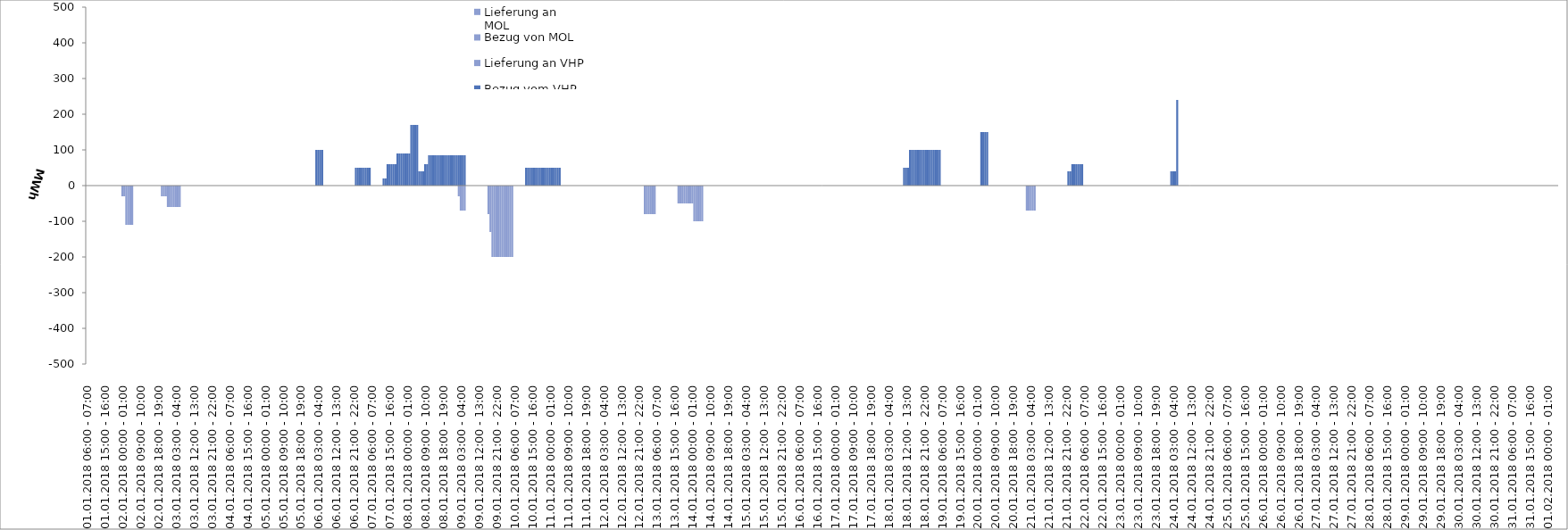
| Category | Bezug vom VHP | Lieferung an VHP | Bezug von MOL | Lieferung an MOL |
|---|---|---|---|---|
| 01.01.2018 06:00 - 07:00 | 0 | 0 | 0 | 0 |
| 01.01.2018 07:00 - 08:00 | 0 | 0 | 0 | 0 |
| 01.01.2018 08:00 - 09:00 | 0 | 0 | 0 | 0 |
| 01.01.2018 09:00 - 10:00 | 0 | 0 | 0 | 0 |
| 01.01.2018 10:00 - 11:00 | 0 | 0 | 0 | 0 |
| 01.01.2018 11:00 - 12:00 | 0 | 0 | 0 | 0 |
| 01.01.2018 12:00 - 13:00 | 0 | 0 | 0 | 0 |
| 01.01.2018 13:00 - 14:00 | 0 | 0 | 0 | 0 |
| 01.01.2018 14:00 - 15:00 | 0 | 0 | 0 | 0 |
| 01.01.2018 15:00 - 16:00 | 0 | 0 | 0 | 0 |
| 01.01.2018 16:00 - 17:00 | 0 | 0 | 0 | 0 |
| 01.01.2018 17:00 - 18:00 | 0 | 0 | 0 | 0 |
| 01.01.2018 18:00 - 19:00 | 0 | 0 | 0 | 0 |
| 01.01.2018 19:00 - 20:00 | 0 | 0 | 0 | 0 |
| 01.01.2018 20:00 - 21:00 | 0 | 0 | 0 | 0 |
| 01.01.2018 21:00 - 22:00 | 0 | 0 | 0 | 0 |
| 01.01.2018 22:00 - 23:00 | 0 | 0 | 0 | 0 |
| 01.01.2018 23:00 - 24:00 | 0 | 0 | 0 | 0 |
| 02.01.2018 00:00 - 01:00 | 0 | -30 | 0 | 0 |
| 02.01.2018 01:00 - 02:00 | 0 | -30 | 0 | 0 |
| 02.01.2018 02:00 - 03:00 | 0 | -110 | 0 | 0 |
| 02.01.2018 03:00 - 04:00 | 0 | -110 | 0 | 0 |
| 02.01.2018 04:00 - 05:00 | 0 | -110 | 0 | 0 |
| 02.01.2018 05:00 - 06:00 | 0 | -110 | 0 | 0 |
| 02.01.2018 06:00 - 07:00 | 0 | 0 | 0 | 0 |
| 02.01.2018 07:00 - 08:00 | 0 | 0 | 0 | 0 |
| 02.01.2018 08:00 - 09:00 | 0 | 0 | 0 | 0 |
| 02.01.2018 09:00 - 10:00 | 0 | 0 | 0 | 0 |
| 02.01.2018 10:00 - 11:00 | 0 | 0 | 0 | 0 |
| 02.01.2018 11:00 - 12:00 | 0 | 0 | 0 | 0 |
| 02.01.2018 12:00 - 13:00 | 0 | 0 | 0 | 0 |
| 02.01.2018 13:00 - 14:00 | 0 | 0 | 0 | 0 |
| 02.01.2018 14:00 - 15:00 | 0 | 0 | 0 | 0 |
| 02.01.2018 15:00 - 16:00 | 0 | 0 | 0 | 0 |
| 02.01.2018 16:00 - 17:00 | 0 | 0 | 0 | 0 |
| 02.01.2018 17:00 - 18:00 | 0 | 0 | 0 | 0 |
| 02.01.2018 18:00 - 19:00 | 0 | 0 | 0 | 0 |
| 02.01.2018 19:00 - 20:00 | 0 | 0 | 0 | 0 |
| 02.01.2018 20:00 - 21:00 | 0 | -30 | 0 | 0 |
| 02.01.2018 21:00 - 22:00 | 0 | -30 | 0 | 0 |
| 02.01.2018 22:00 - 23:00 | 0 | -30 | 0 | 0 |
| 02.01.2018 23:00 - 24:00 | 0 | -60 | 0 | 0 |
| 03.01.2018 00:00 - 01:00 | 0 | -60 | 0 | 0 |
| 03.01.2018 01:00 - 02:00 | 0 | -60 | 0 | 0 |
| 03.01.2018 02:00 - 03:00 | 0 | -60 | 0 | 0 |
| 03.01.2018 03:00 - 04:00 | 0 | -60 | 0 | 0 |
| 03.01.2018 04:00 - 05:00 | 0 | -60 | 0 | 0 |
| 03.01.2018 05:00 - 06:00 | 0 | -60 | 0 | 0 |
| 03.01.2018 06:00 - 07:00 | 0 | 0 | 0 | 0 |
| 03.01.2018 07:00 - 08:00 | 0 | 0 | 0 | 0 |
| 03.01.2018 08:00 - 09:00 | 0 | 0 | 0 | 0 |
| 03.01.2018 09:00 - 10:00 | 0 | 0 | 0 | 0 |
| 03.01.2018 10:00 - 11:00 | 0 | 0 | 0 | 0 |
| 03.01.2018 11:00 - 12:00 | 0 | 0 | 0 | 0 |
| 03.01.2018 12:00 - 13:00 | 0 | 0 | 0 | 0 |
| 03.01.2018 13:00 - 14:00 | 0 | 0 | 0 | 0 |
| 03.01.2018 14:00 - 15:00 | 0 | 0 | 0 | 0 |
| 03.01.2018 15:00 - 16:00 | 0 | 0 | 0 | 0 |
| 03.01.2018 16:00 - 17:00 | 0 | 0 | 0 | 0 |
| 03.01.2018 17:00 - 18:00 | 0 | 0 | 0 | 0 |
| 03.01.2018 18:00 - 19:00 | 0 | 0 | 0 | 0 |
| 03.01.2018 19:00 - 20:00 | 0 | 0 | 0 | 0 |
| 03.01.2018 20:00 - 21:00 | 0 | 0 | 0 | 0 |
| 03.01.2018 21:00 - 22:00 | 0 | 0 | 0 | 0 |
| 03.01.2018 22:00 - 23:00 | 0 | 0 | 0 | 0 |
| 03.01.2018 23:00 - 24:00 | 0 | 0 | 0 | 0 |
| 04.01.2018 00:00 - 01:00 | 0 | 0 | 0 | 0 |
| 04.01.2018 01:00 - 02:00 | 0 | 0 | 0 | 0 |
| 04.01.2018 02:00 - 03:00 | 0 | 0 | 0 | 0 |
| 04.01.2018 03:00 - 04:00 | 0 | 0 | 0 | 0 |
| 04.01.2018 04:00 - 05:00 | 0 | 0 | 0 | 0 |
| 04.01.2018 05:00 - 06:00 | 0 | 0 | 0 | 0 |
| 04.01.2018 06:00 - 07:00 | 0 | 0 | 0 | 0 |
| 04.01.2018 07:00 - 08:00 | 0 | 0 | 0 | 0 |
| 04.01.2018 08:00 - 09:00 | 0 | 0 | 0 | 0 |
| 04.01.2018 09:00 - 10:00 | 0 | 0 | 0 | 0 |
| 04.01.2018 10:00 - 11:00 | 0 | 0 | 0 | 0 |
| 04.01.2018 11:00 - 12:00 | 0 | 0 | 0 | 0 |
| 04.01.2018 12:00 - 13:00 | 0 | 0 | 0 | 0 |
| 04.01.2018 13:00 - 14:00 | 0 | 0 | 0 | 0 |
| 04.01.2018 14:00 - 15:00 | 0 | 0 | 0 | 0 |
| 04.01.2018 15:00 - 16:00 | 0 | 0 | 0 | 0 |
| 04.01.2018 16:00 - 17:00 | 0 | 0 | 0 | 0 |
| 04.01.2018 17:00 - 18:00 | 0 | 0 | 0 | 0 |
| 04.01.2018 18:00 - 19:00 | 0 | 0 | 0 | 0 |
| 04.01.2018 19:00 - 20:00 | 0 | 0 | 0 | 0 |
| 04.01.2018 20:00 - 21:00 | 0 | 0 | 0 | 0 |
| 04.01.2018 21:00 - 22:00 | 0 | 0 | 0 | 0 |
| 04.01.2018 22:00 - 23:00 | 0 | 0 | 0 | 0 |
| 04.01.2018 23:00 - 24:00 | 0 | 0 | 0 | 0 |
| 05.01.2018 00:00 - 01:00 | 0 | 0 | 0 | 0 |
| 05.01.2018 01:00 - 02:00 | 0 | 0 | 0 | 0 |
| 05.01.2018 02:00 - 03:00 | 0 | 0 | 0 | 0 |
| 05.01.2018 03:00 - 04:00 | 0 | 0 | 0 | 0 |
| 05.01.2018 04:00 - 05:00 | 0 | 0 | 0 | 0 |
| 05.01.2018 05:00 - 06:00 | 0 | 0 | 0 | 0 |
| 05.01.2018 06:00 - 07:00 | 0 | 0 | 0 | 0 |
| 05.01.2018 07:00 - 08:00 | 0 | 0 | 0 | 0 |
| 05.01.2018 08:00 - 09:00 | 0 | 0 | 0 | 0 |
| 05.01.2018 09:00 - 10:00 | 0 | 0 | 0 | 0 |
| 05.01.2018 10:00 - 11:00 | 0 | 0 | 0 | 0 |
| 05.01.2018 11:00 - 12:00 | 0 | 0 | 0 | 0 |
| 05.01.2018 12:00 - 13:00 | 0 | 0 | 0 | 0 |
| 05.01.2018 13:00 - 14:00 | 0 | 0 | 0 | 0 |
| 05.01.2018 14:00 - 15:00 | 0 | 0 | 0 | 0 |
| 05.01.2018 15:00 - 16:00 | 0 | 0 | 0 | 0 |
| 05.01.2018 16:00 - 17:00 | 0 | 0 | 0 | 0 |
| 05.01.2018 17:00 - 18:00 | 0 | 0 | 0 | 0 |
| 05.01.2018 18:00 - 19:00 | 0 | 0 | 0 | 0 |
| 05.01.2018 19:00 - 20:00 | 0 | 0 | 0 | 0 |
| 05.01.2018 20:00 - 21:00 | 0 | 0 | 0 | 0 |
| 05.01.2018 21:00 - 22:00 | 0 | 0 | 0 | 0 |
| 05.01.2018 22:00 - 23:00 | 0 | 0 | 0 | 0 |
| 05.01.2018 23:00 - 24:00 | 0 | 0 | 0 | 0 |
| 06.01.2018 00:00 - 01:00 | 0 | 0 | 0 | 0 |
| 06.01.2018 01:00 - 02:00 | 0 | 0 | 0 | 0 |
| 06.01.2018 02:00 - 03:00 | 100 | 0 | 0 | 0 |
| 06.01.2018 03:00 - 04:00 | 100 | 0 | 0 | 0 |
| 06.01.2018 04:00 - 05:00 | 100 | 0 | 0 | 0 |
| 06.01.2018 05:00 - 06:00 | 100 | 0 | 0 | 0 |
| 06.01.2018 06:00 - 07:00 | 0 | 0 | 0 | 0 |
| 06.01.2018 07:00 - 08:00 | 0 | 0 | 0 | 0 |
| 06.01.2018 08:00 - 09:00 | 0 | 0 | 0 | 0 |
| 06.01.2018 09:00 - 10:00 | 0 | 0 | 0 | 0 |
| 06.01.2018 10:00 - 11:00 | 0 | 0 | 0 | 0 |
| 06.01.2018 11:00 - 12:00 | 0 | 0 | 0 | 0 |
| 06.01.2018 12:00 - 13:00 | 0 | 0 | 0 | 0 |
| 06.01.2018 13:00 - 14:00 | 0 | 0 | 0 | 0 |
| 06.01.2018 14:00 - 15:00 | 0 | 0 | 0 | 0 |
| 06.01.2018 15:00 - 16:00 | 0 | 0 | 0 | 0 |
| 06.01.2018 16:00 - 17:00 | 0 | 0 | 0 | 0 |
| 06.01.2018 17:00 - 18:00 | 0 | 0 | 0 | 0 |
| 06.01.2018 18:00 - 19:00 | 0 | 0 | 0 | 0 |
| 06.01.2018 19:00 - 20:00 | 0 | 0 | 0 | 0 |
| 06.01.2018 20:00 - 21:00 | 0 | 0 | 0 | 0 |
| 06.01.2018 21:00 - 22:00 | 0 | 0 | 0 | 0 |
| 06.01.2018 22:00 - 23:00 | 50 | 0 | 0 | 0 |
| 06.01.2018 23:00 - 24:00 | 50 | 0 | 0 | 0 |
| 07.01.2018 00:00 - 01:00 | 50 | 0 | 0 | 0 |
| 07.01.2018 01:00 - 02:00 | 50 | 0 | 0 | 0 |
| 07.01.2018 02:00 - 03:00 | 50 | 0 | 0 | 0 |
| 07.01.2018 03:00 - 04:00 | 50 | 0 | 0 | 0 |
| 07.01.2018 04:00 - 05:00 | 50 | 0 | 0 | 0 |
| 07.01.2018 05:00 - 06:00 | 50 | 0 | 0 | 0 |
| 07.01.2018 06:00 - 07:00 | 0 | 0 | 0 | 0 |
| 07.01.2018 07:00 - 08:00 | 0 | 0 | 0 | 0 |
| 07.01.2018 08:00 - 09:00 | 0 | 0 | 0 | 0 |
| 07.01.2018 09:00 - 10:00 | 0 | 0 | 0 | 0 |
| 07.01.2018 10:00 - 11:00 | 0 | 0 | 0 | 0 |
| 07.01.2018 11:00 - 12:00 | 0 | 0 | 0 | 0 |
| 07.01.2018 12:00 - 13:00 | 20 | 0 | 0 | 0 |
| 07.01.2018 13:00 - 14:00 | 20 | 0 | 0 | 0 |
| 07.01.2018 14:00 - 15:00 | 60 | 0 | 0 | 0 |
| 07.01.2018 15:00 - 16:00 | 60 | 0 | 0 | 0 |
| 07.01.2018 16:00 - 17:00 | 60 | 0 | 0 | 0 |
| 07.01.2018 17:00 - 18:00 | 60 | 0 | 0 | 0 |
| 07.01.2018 18:00 - 19:00 | 60 | 0 | 0 | 0 |
| 07.01.2018 19:00 - 20:00 | 90 | 0 | 0 | 0 |
| 07.01.2018 20:00 - 21:00 | 90 | 0 | 0 | 0 |
| 07.01.2018 21:00 - 22:00 | 90 | 0 | 0 | 0 |
| 07.01.2018 22:00 - 23:00 | 90 | 0 | 0 | 0 |
| 07.01.2018 23:00 - 24:00 | 90 | 0 | 0 | 0 |
| 08.01.2018 00:00 - 01:00 | 90 | 0 | 0 | 0 |
| 08.01.2018 01:00 - 02:00 | 90 | 0 | 0 | 0 |
| 08.01.2018 02:00 - 03:00 | 170 | 0 | 0 | 0 |
| 08.01.2018 03:00 - 04:00 | 170 | 0 | 0 | 0 |
| 08.01.2018 04:00 - 05:00 | 170 | 0 | 0 | 0 |
| 08.01.2018 05:00 - 06:00 | 170 | 0 | 0 | 0 |
| 08.01.2018 06:00 - 07:00 | 40 | 0 | 0 | 0 |
| 08.01.2018 07:00 - 08:00 | 40 | 0 | 0 | 0 |
| 08.01.2018 08:00 - 09:00 | 40 | 0 | 0 | 0 |
| 08.01.2018 09:00 - 10:00 | 60 | 0 | 0 | 0 |
| 08.01.2018 10:00 - 11:00 | 60 | 0 | 0 | 0 |
| 08.01.2018 11:00 - 12:00 | 85 | 0 | 0 | 0 |
| 08.01.2018 12:00 - 13:00 | 85 | 0 | 0 | 0 |
| 08.01.2018 13:00 - 14:00 | 85 | 0 | 0 | 0 |
| 08.01.2018 14:00 - 15:00 | 85 | 0 | 0 | 0 |
| 08.01.2018 15:00 - 16:00 | 85 | 0 | 0 | 0 |
| 08.01.2018 16:00 - 17:00 | 85 | 0 | 0 | 0 |
| 08.01.2018 17:00 - 18:00 | 85 | 0 | 0 | 0 |
| 08.01.2018 18:00 - 19:00 | 85 | 0 | 0 | 0 |
| 08.01.2018 19:00 - 20:00 | 85 | 0 | 0 | 0 |
| 08.01.2018 20:00 - 21:00 | 85 | 0 | 0 | 0 |
| 08.01.2018 21:00 - 22:00 | 85 | 0 | 0 | 0 |
| 08.01.2018 22:00 - 23:00 | 85 | 0 | 0 | 0 |
| 08.01.2018 23:00 - 24:00 | 85 | 0 | 0 | 0 |
| 09.01.2018 00:00 - 01:00 | 85 | 0 | 0 | 0 |
| 09.01.2018 01:00 - 02:00 | 85 | 0 | 0 | 0 |
| 09.01.2018 02:00 - 03:00 | 85 | -30 | 0 | 0 |
| 09.01.2018 03:00 - 04:00 | 85 | -70 | 0 | 0 |
| 09.01.2018 04:00 - 05:00 | 85 | -70 | 0 | 0 |
| 09.01.2018 05:00 - 06:00 | 85 | -70 | 0 | 0 |
| 09.01.2018 06:00 - 07:00 | 0 | 0 | 0 | 0 |
| 09.01.2018 07:00 - 08:00 | 0 | 0 | 0 | 0 |
| 09.01.2018 08:00 - 09:00 | 0 | 0 | 0 | 0 |
| 09.01.2018 09:00 - 10:00 | 0 | 0 | 0 | 0 |
| 09.01.2018 10:00 - 11:00 | 0 | 0 | 0 | 0 |
| 09.01.2018 11:00 - 12:00 | 0 | 0 | 0 | 0 |
| 09.01.2018 12:00 - 13:00 | 0 | 0 | 0 | 0 |
| 09.01.2018 13:00 - 14:00 | 0 | 0 | 0 | 0 |
| 09.01.2018 14:00 - 15:00 | 0 | 0 | 0 | 0 |
| 09.01.2018 15:00 - 16:00 | 0 | 0 | 0 | 0 |
| 09.01.2018 16:00 - 17:00 | 0 | 0 | 0 | 0 |
| 09.01.2018 17:00 - 18:00 | 0 | -80 | 0 | 0 |
| 09.01.2018 18:00 - 19:00 | 0 | -130 | 0 | 0 |
| 09.01.2018 19:00 - 20:00 | 0 | -200 | 0 | 0 |
| 09.01.2018 20:00 - 21:00 | 0 | -200 | 0 | 0 |
| 09.01.2018 21:00 - 22:00 | 0 | -200 | 0 | 0 |
| 09.01.2018 22:00 - 23:00 | 0 | -200 | 0 | 0 |
| 09.01.2018 23:00 - 24:00 | 0 | -200 | 0 | 0 |
| 10.01.2018 00:00 - 01:00 | 0 | -200 | 0 | 0 |
| 10.01.2018 01:00 - 02:00 | 0 | -200 | 0 | 0 |
| 10.01.2018 02:00 - 03:00 | 0 | -200 | 0 | 0 |
| 10.01.2018 03:00 - 04:00 | 0 | -200 | 0 | 0 |
| 10.01.2018 04:00 - 05:00 | 0 | -200 | 0 | 0 |
| 10.01.2018 05:00 - 06:00 | 0 | -200 | 0 | 0 |
| 10.01.2018 06:00 - 07:00 | 0 | 0 | 0 | 0 |
| 10.01.2018 07:00 - 08:00 | 0 | 0 | 0 | 0 |
| 10.01.2018 08:00 - 09:00 | 0 | 0 | 0 | 0 |
| 10.01.2018 09:00 - 10:00 | 0 | 0 | 0 | 0 |
| 10.01.2018 10:00 - 11:00 | 0 | 0 | 0 | 0 |
| 10.01.2018 11:00 - 12:00 | 0 | 0 | 0 | 0 |
| 10.01.2018 12:00 - 13:00 | 50 | 0 | 0 | 0 |
| 10.01.2018 13:00 - 14:00 | 50 | 0 | 0 | 0 |
| 10.01.2018 14:00 - 15:00 | 50 | 0 | 0 | 0 |
| 10.01.2018 15:00 - 16:00 | 50 | 0 | 0 | 0 |
| 10.01.2018 16:00 - 17:00 | 50 | 0 | 0 | 0 |
| 10.01.2018 17:00 - 18:00 | 50 | 0 | 0 | 0 |
| 10.01.2018 18:00 - 19:00 | 50 | 0 | 0 | 0 |
| 10.01.2018 19:00 - 20:00 | 50 | 0 | 0 | 0 |
| 10.01.2018 20:00 - 21:00 | 50 | 0 | 0 | 0 |
| 10.01.2018 21:00 - 22:00 | 50 | 0 | 0 | 0 |
| 10.01.2018 22:00 - 23:00 | 50 | 0 | 0 | 0 |
| 10.01.2018 23:00 - 24:00 | 50 | 0 | 0 | 0 |
| 11.01.2018 00:00 - 01:00 | 50 | 0 | 0 | 0 |
| 11.01.2018 01:00 - 02:00 | 50 | 0 | 0 | 0 |
| 11.01.2018 02:00 - 03:00 | 50 | 0 | 0 | 0 |
| 11.01.2018 03:00 - 04:00 | 50 | 0 | 0 | 0 |
| 11.01.2018 04:00 - 05:00 | 50 | 0 | 0 | 0 |
| 11.01.2018 05:00 - 06:00 | 50 | 0 | 0 | 0 |
| 11.01.2018 06:00 - 07:00 | 0 | 0 | 0 | 0 |
| 11.01.2018 07:00 - 08:00 | 0 | 0 | 0 | 0 |
| 11.01.2018 08:00 - 09:00 | 0 | 0 | 0 | 0 |
| 11.01.2018 09:00 - 10:00 | 0 | 0 | 0 | 0 |
| 11.01.2018 10:00 - 11:00 | 0 | 0 | 0 | 0 |
| 11.01.2018 11:00 - 12:00 | 0 | 0 | 0 | 0 |
| 11.01.2018 12:00 - 13:00 | 0 | 0 | 0 | 0 |
| 11.01.2018 13:00 - 14:00 | 0 | 0 | 0 | 0 |
| 11.01.2018 14:00 - 15:00 | 0 | 0 | 0 | 0 |
| 11.01.2018 15:00 - 16:00 | 0 | 0 | 0 | 0 |
| 11.01.2018 16:00 - 17:00 | 0 | 0 | 0 | 0 |
| 11.01.2018 17:00 - 18:00 | 0 | 0 | 0 | 0 |
| 11.01.2018 18:00 - 19:00 | 0 | 0 | 0 | 0 |
| 11.01.2018 19:00 - 20:00 | 0 | 0 | 0 | 0 |
| 11.01.2018 20:00 - 21:00 | 0 | 0 | 0 | 0 |
| 11.01.2018 21:00 - 22:00 | 0 | 0 | 0 | 0 |
| 11.01.2018 22:00 - 23:00 | 0 | 0 | 0 | 0 |
| 11.01.2018 23:00 - 24:00 | 0 | 0 | 0 | 0 |
| 12.01.2018 00:00 - 01:00 | 0 | 0 | 0 | 0 |
| 12.01.2018 01:00 - 02:00 | 0 | 0 | 0 | 0 |
| 12.01.2018 02:00 - 03:00 | 0 | 0 | 0 | 0 |
| 12.01.2018 03:00 - 04:00 | 0 | 0 | 0 | 0 |
| 12.01.2018 04:00 - 05:00 | 0 | 0 | 0 | 0 |
| 12.01.2018 05:00 - 06:00 | 0 | 0 | 0 | 0 |
| 12.01.2018 06:00 - 07:00 | 0 | 0 | 0 | 0 |
| 12.01.2018 07:00 - 08:00 | 0 | 0 | 0 | 0 |
| 12.01.2018 08:00 - 09:00 | 0 | 0 | 0 | 0 |
| 12.01.2018 09:00 - 10:00 | 0 | 0 | 0 | 0 |
| 12.01.2018 10:00 - 11:00 | 0 | 0 | 0 | 0 |
| 12.01.2018 11:00 - 12:00 | 0 | 0 | 0 | 0 |
| 12.01.2018 12:00 - 13:00 | 0 | 0 | 0 | 0 |
| 12.01.2018 13:00 - 14:00 | 0 | 0 | 0 | 0 |
| 12.01.2018 14:00 - 15:00 | 0 | 0 | 0 | 0 |
| 12.01.2018 15:00 - 16:00 | 0 | 0 | 0 | 0 |
| 12.01.2018 16:00 - 17:00 | 0 | 0 | 0 | 0 |
| 12.01.2018 17:00 - 18:00 | 0 | 0 | 0 | 0 |
| 12.01.2018 18:00 - 19:00 | 0 | 0 | 0 | 0 |
| 12.01.2018 19:00 - 20:00 | 0 | 0 | 0 | 0 |
| 12.01.2018 20:00 - 21:00 | 0 | 0 | 0 | 0 |
| 12.01.2018 21:00 - 22:00 | 0 | 0 | 0 | 0 |
| 12.01.2018 22:00 - 23:00 | 0 | 0 | 0 | 0 |
| 12.01.2018 23:00 - 24:00 | 0 | 0 | 0 | 0 |
| 13.01.2018 00:00 - 01:00 | 0 | -80 | 0 | 0 |
| 13.01.2018 01:00 - 02:00 | 0 | -80 | 0 | 0 |
| 13.01.2018 02:00 - 03:00 | 0 | -80 | 0 | 0 |
| 13.01.2018 03:00 - 04:00 | 0 | -80 | 0 | 0 |
| 13.01.2018 04:00 - 05:00 | 0 | -80 | 0 | 0 |
| 13.01.2018 05:00 - 06:00 | 0 | -80 | 0 | 0 |
| 13.01.2018 06:00 - 07:00 | 0 | 0 | 0 | 0 |
| 13.01.2018 07:00 - 08:00 | 0 | 0 | 0 | 0 |
| 13.01.2018 08:00 - 09:00 | 0 | 0 | 0 | 0 |
| 13.01.2018 09:00 - 10:00 | 0 | 0 | 0 | 0 |
| 13.01.2018 10:00 - 11:00 | 0 | 0 | 0 | 0 |
| 13.01.2018 11:00 - 12:00 | 0 | 0 | 0 | 0 |
| 13.01.2018 12:00 - 13:00 | 0 | 0 | 0 | 0 |
| 13.01.2018 13:00 - 14:00 | 0 | 0 | 0 | 0 |
| 13.01.2018 14:00 - 15:00 | 0 | 0 | 0 | 0 |
| 13.01.2018 15:00 - 16:00 | 0 | 0 | 0 | 0 |
| 13.01.2018 16:00 - 17:00 | 0 | 0 | 0 | 0 |
| 13.01.2018 17:00 - 18:00 | 0 | -50 | 0 | 0 |
| 13.01.2018 18:00 - 19:00 | 0 | -50 | 0 | 0 |
| 13.01.2018 19:00 - 20:00 | 0 | -50 | 0 | 0 |
| 13.01.2018 20:00 - 21:00 | 0 | -50 | 0 | 0 |
| 13.01.2018 21:00 - 22:00 | 0 | -50 | 0 | 0 |
| 13.01.2018 22:00 - 23:00 | 0 | -50 | 0 | 0 |
| 13.01.2018 23:00 - 24:00 | 0 | -50 | 0 | 0 |
| 14.01.2018 00:00 - 01:00 | 0 | -50 | 0 | 0 |
| 14.01.2018 01:00 - 02:00 | 0 | -100 | 0 | 0 |
| 14.01.2018 02:00 - 03:00 | 0 | -100 | 0 | 0 |
| 14.01.2018 03:00 - 04:00 | 0 | -100 | 0 | 0 |
| 14.01.2018 04:00 - 05:00 | 0 | -100 | 0 | 0 |
| 14.01.2018 05:00 - 06:00 | 0 | -100 | 0 | 0 |
| 14.01.2018 06:00 - 07:00 | 0 | 0 | 0 | 0 |
| 14.01.2018 07:00 - 08:00 | 0 | 0 | 0 | 0 |
| 14.01.2018 08:00 - 09:00 | 0 | 0 | 0 | 0 |
| 14.01.2018 09:00 - 10:00 | 0 | 0 | 0 | 0 |
| 14.01.2018 10:00 - 11:00 | 0 | 0 | 0 | 0 |
| 14.01.2018 11:00 - 12:00 | 0 | 0 | 0 | 0 |
| 14.01.2018 12:00 - 13:00 | 0 | 0 | 0 | 0 |
| 14.01.2018 13:00 - 14:00 | 0 | 0 | 0 | 0 |
| 14.01.2018 14:00 - 15:00 | 0 | 0 | 0 | 0 |
| 14.01.2018 15:00 - 16:00 | 0 | 0 | 0 | 0 |
| 14.01.2018 16:00 - 17:00 | 0 | 0 | 0 | 0 |
| 14.01.2018 17:00 - 18:00 | 0 | 0 | 0 | 0 |
| 14.01.2018 18:00 - 19:00 | 0 | 0 | 0 | 0 |
| 14.01.2018 19:00 - 20:00 | 0 | 0 | 0 | 0 |
| 14.01.2018 20:00 - 21:00 | 0 | 0 | 0 | 0 |
| 14.01.2018 21:00 - 22:00 | 0 | 0 | 0 | 0 |
| 14.01.2018 22:00 - 23:00 | 0 | 0 | 0 | 0 |
| 14.01.2018 23:00 - 24:00 | 0 | 0 | 0 | 0 |
| 15.01.2018 00:00 - 01:00 | 0 | 0 | 0 | 0 |
| 15.01.2018 01:00 - 02:00 | 0 | 0 | 0 | 0 |
| 15.01.2018 02:00 - 03:00 | 0 | 0 | 0 | 0 |
| 15.01.2018 03:00 - 04:00 | 0 | 0 | 0 | 0 |
| 15.01.2018 04:00 - 05:00 | 0 | 0 | 0 | 0 |
| 15.01.2018 05:00 - 06:00 | 0 | 0 | 0 | 0 |
| 15.01.2018 06:00 - 07:00 | 0 | 0 | 0 | 0 |
| 15.01.2018 07:00 - 08:00 | 0 | 0 | 0 | 0 |
| 15.01.2018 08:00 - 09:00 | 0 | 0 | 0 | 0 |
| 15.01.2018 09:00 - 10:00 | 0 | 0 | 0 | 0 |
| 15.01.2018 10:00 - 11:00 | 0 | 0 | 0 | 0 |
| 15.01.2018 11:00 - 12:00 | 0 | 0 | 0 | 0 |
| 15.01.2018 12:00 - 13:00 | 0 | 0 | 0 | 0 |
| 15.01.2018 13:00 - 14:00 | 0 | 0 | 0 | 0 |
| 15.01.2018 14:00 - 15:00 | 0 | 0 | 0 | 0 |
| 15.01.2018 15:00 - 16:00 | 0 | 0 | 0 | 0 |
| 15.01.2018 16:00 - 17:00 | 0 | 0 | 0 | 0 |
| 15.01.2018 17:00 - 18:00 | 0 | 0 | 0 | 0 |
| 15.01.2018 18:00 - 19:00 | 0 | 0 | 0 | 0 |
| 15.01.2018 19:00 - 20:00 | 0 | 0 | 0 | 0 |
| 15.01.2018 20:00 - 21:00 | 0 | 0 | 0 | 0 |
| 15.01.2018 21:00 - 22:00 | 0 | 0 | 0 | 0 |
| 15.01.2018 22:00 - 23:00 | 0 | 0 | 0 | 0 |
| 15.01.2018 23:00 - 24:00 | 0 | 0 | 0 | 0 |
| 16.01.2018 00:00 - 01:00 | 0 | 0 | 0 | 0 |
| 16.01.2018 01:00 - 02:00 | 0 | 0 | 0 | 0 |
| 16.01.2018 02:00 - 03:00 | 0 | 0 | 0 | 0 |
| 16.01.2018 03:00 - 04:00 | 0 | 0 | 0 | 0 |
| 16.01.2018 04:00 - 05:00 | 0 | 0 | 0 | 0 |
| 16.01.2018 05:00 - 06:00 | 0 | 0 | 0 | 0 |
| 16.01.2018 06:00 - 07:00 | 0 | 0 | 0 | 0 |
| 16.01.2018 07:00 - 08:00 | 0 | 0 | 0 | 0 |
| 16.01.2018 08:00 - 09:00 | 0 | 0 | 0 | 0 |
| 16.01.2018 09:00 - 10:00 | 0 | 0 | 0 | 0 |
| 16.01.2018 10:00 - 11:00 | 0 | 0 | 0 | 0 |
| 16.01.2018 11:00 - 12:00 | 0 | 0 | 0 | 0 |
| 16.01.2018 12:00 - 13:00 | 0 | 0 | 0 | 0 |
| 16.01.2018 13:00 - 14:00 | 0 | 0 | 0 | 0 |
| 16.01.2018 14:00 - 15:00 | 0 | 0 | 0 | 0 |
| 16.01.2018 15:00 - 16:00 | 0 | 0 | 0 | 0 |
| 16.01.2018 16:00 - 17:00 | 0 | 0 | 0 | 0 |
| 16.01.2018 17:00 - 18:00 | 0 | 0 | 0 | 0 |
| 16.01.2018 18:00 - 19:00 | 0 | 0 | 0 | 0 |
| 16.01.2018 19:00 - 20:00 | 0 | 0 | 0 | 0 |
| 16.01.2018 20:00 - 21:00 | 0 | 0 | 0 | 0 |
| 16.01.2018 21:00 - 22:00 | 0 | 0 | 0 | 0 |
| 16.01.2018 22:00 - 23:00 | 0 | 0 | 0 | 0 |
| 16.01.2018 23:00 - 24:00 | 0 | 0 | 0 | 0 |
| 17.01.2018 00:00 - 01:00 | 0 | 0 | 0 | 0 |
| 17.01.2018 01:00 - 02:00 | 0 | 0 | 0 | 0 |
| 17.01.2018 02:00 - 03:00 | 0 | 0 | 0 | 0 |
| 17.01.2018 03:00 - 04:00 | 0 | 0 | 0 | 0 |
| 17.01.2018 04:00 - 05:00 | 0 | 0 | 0 | 0 |
| 17.01.2018 05:00 - 06:00 | 0 | 0 | 0 | 0 |
| 17.01.2018 06:00 - 07:00 | 0 | 0 | 0 | 0 |
| 17.01.2018 07:00 - 08:00 | 0 | 0 | 0 | 0 |
| 17.01.2018 08:00 - 09:00 | 0 | 0 | 0 | 0 |
| 17.01.2018 09:00 - 10:00 | 0 | 0 | 0 | 0 |
| 17.01.2018 10:00 - 11:00 | 0 | 0 | 0 | 0 |
| 17.01.2018 11:00 - 12:00 | 0 | 0 | 0 | 0 |
| 17.01.2018 12:00 - 13:00 | 0 | 0 | 0 | 0 |
| 17.01.2018 13:00 - 14:00 | 0 | 0 | 0 | 0 |
| 17.01.2018 14:00 - 15:00 | 0 | 0 | 0 | 0 |
| 17.01.2018 15:00 - 16:00 | 0 | 0 | 0 | 0 |
| 17.01.2018 16:00 - 17:00 | 0 | 0 | 0 | 0 |
| 17.01.2018 17:00 - 18:00 | 0 | 0 | 0 | 0 |
| 17.01.2018 18:00 - 19:00 | 0 | 0 | 0 | 0 |
| 17.01.2018 19:00 - 20:00 | 0 | 0 | 0 | 0 |
| 17.01.2018 20:00 - 21:00 | 0 | 0 | 0 | 0 |
| 17.01.2018 21:00 - 22:00 | 0 | 0 | 0 | 0 |
| 17.01.2018 22:00 - 23:00 | 0 | 0 | 0 | 0 |
| 17.01.2018 23:00 - 24:00 | 0 | 0 | 0 | 0 |
| 18.01.2018 00:00 - 01:00 | 0 | 0 | 0 | 0 |
| 18.01.2018 01:00 - 02:00 | 0 | 0 | 0 | 0 |
| 18.01.2018 02:00 - 03:00 | 0 | 0 | 0 | 0 |
| 18.01.2018 03:00 - 04:00 | 0 | 0 | 0 | 0 |
| 18.01.2018 04:00 - 05:00 | 0 | 0 | 0 | 0 |
| 18.01.2018 05:00 - 06:00 | 0 | 0 | 0 | 0 |
| 18.01.2018 06:00 - 07:00 | 0 | 0 | 0 | 0 |
| 18.01.2018 07:00 - 08:00 | 0 | 0 | 0 | 0 |
| 18.01.2018 08:00 - 09:00 | 0 | 0 | 0 | 0 |
| 18.01.2018 09:00 - 10:00 | 0 | 0 | 0 | 0 |
| 18.01.2018 10:00 - 11:00 | 0 | 0 | 0 | 0 |
| 18.01.2018 11:00 - 12:00 | 50 | 0 | 0 | 0 |
| 18.01.2018 12:00 - 13:00 | 50 | 0 | 0 | 0 |
| 18.01.2018 13:00 - 14:00 | 50 | 0 | 0 | 0 |
| 18.01.2018 14:00 - 15:00 | 100 | 0 | 0 | 0 |
| 18.01.2018 15:00 - 16:00 | 100 | 0 | 0 | 0 |
| 18.01.2018 16:00 - 17:00 | 100 | 0 | 0 | 0 |
| 18.01.2018 17:00 - 18:00 | 100 | 0 | 0 | 0 |
| 18.01.2018 18:00 - 19:00 | 100 | 0 | 0 | 0 |
| 18.01.2018 19:00 - 20:00 | 100 | 0 | 0 | 0 |
| 18.01.2018 20:00 - 21:00 | 100 | 0 | 0 | 0 |
| 18.01.2018 21:00 - 22:00 | 100 | 0 | 0 | 0 |
| 18.01.2018 22:00 - 23:00 | 100 | 0 | 0 | 0 |
| 18.01.2018 23:00 - 24:00 | 100 | 0 | 0 | 0 |
| 19.01.2018 00:00 - 01:00 | 100 | 0 | 0 | 0 |
| 19.01.2018 01:00 - 02:00 | 100 | 0 | 0 | 0 |
| 19.01.2018 02:00 - 03:00 | 100 | 0 | 0 | 0 |
| 19.01.2018 03:00 - 04:00 | 100 | 0 | 0 | 0 |
| 19.01.2018 04:00 - 05:00 | 100 | 0 | 0 | 0 |
| 19.01.2018 05:00 - 06:00 | 100 | 0 | 0 | 0 |
| 19.01.2018 06:00 - 07:00 | 0 | 0 | 0 | 0 |
| 19.01.2018 07:00 - 08:00 | 0 | 0 | 0 | 0 |
| 19.01.2018 08:00 - 09:00 | 0 | 0 | 0 | 0 |
| 19.01.2018 09:00 - 10:00 | 0 | 0 | 0 | 0 |
| 19.01.2018 10:00 - 11:00 | 0 | 0 | 0 | 0 |
| 19.01.2018 11:00 - 12:00 | 0 | 0 | 0 | 0 |
| 19.01.2018 12:00 - 13:00 | 0 | 0 | 0 | 0 |
| 19.01.2018 13:00 - 14:00 | 0 | 0 | 0 | 0 |
| 19.01.2018 14:00 - 15:00 | 0 | 0 | 0 | 0 |
| 19.01.2018 15:00 - 16:00 | 0 | 0 | 0 | 0 |
| 19.01.2018 16:00 - 17:00 | 0 | 0 | 0 | 0 |
| 19.01.2018 17:00 - 18:00 | 0 | 0 | 0 | 0 |
| 19.01.2018 18:00 - 19:00 | 0 | 0 | 0 | 0 |
| 19.01.2018 19:00 - 20:00 | 0 | 0 | 0 | 0 |
| 19.01.2018 20:00 - 21:00 | 0 | 0 | 0 | 0 |
| 19.01.2018 21:00 - 22:00 | 0 | 0 | 0 | 0 |
| 19.01.2018 22:00 - 23:00 | 0 | 0 | 0 | 0 |
| 19.01.2018 23:00 - 24:00 | 0 | 0 | 0 | 0 |
| 20.01.2018 00:00 - 01:00 | 0 | 0 | 0 | 0 |
| 20.01.2018 01:00 - 02:00 | 0 | 0 | 0 | 0 |
| 20.01.2018 02:00 - 03:00 | 150 | 0 | 0 | 0 |
| 20.01.2018 03:00 - 04:00 | 150 | 0 | 0 | 0 |
| 20.01.2018 04:00 - 05:00 | 150 | 0 | 0 | 0 |
| 20.01.2018 05:00 - 06:00 | 150 | 0 | 0 | 0 |
| 20.01.2018 06:00 - 07:00 | 0 | 0 | 0 | 0 |
| 20.01.2018 07:00 - 08:00 | 0 | 0 | 0 | 0 |
| 20.01.2018 08:00 - 09:00 | 0 | 0 | 0 | 0 |
| 20.01.2018 09:00 - 10:00 | 0 | 0 | 0 | 0 |
| 20.01.2018 10:00 - 11:00 | 0 | 0 | 0 | 0 |
| 20.01.2018 11:00 - 12:00 | 0 | 0 | 0 | 0 |
| 20.01.2018 12:00 - 13:00 | 0 | 0 | 0 | 0 |
| 20.01.2018 13:00 - 14:00 | 0 | 0 | 0 | 0 |
| 20.01.2018 14:00 - 15:00 | 0 | 0 | 0 | 0 |
| 20.01.2018 15:00 - 16:00 | 0 | 0 | 0 | 0 |
| 20.01.2018 16:00 - 17:00 | 0 | 0 | 0 | 0 |
| 20.01.2018 17:00 - 18:00 | 0 | 0 | 0 | 0 |
| 20.01.2018 18:00 - 19:00 | 0 | 0 | 0 | 0 |
| 20.01.2018 19:00 - 20:00 | 0 | 0 | 0 | 0 |
| 20.01.2018 20:00 - 21:00 | 0 | 0 | 0 | 0 |
| 20.01.2018 21:00 - 22:00 | 0 | 0 | 0 | 0 |
| 20.01.2018 22:00 - 23:00 | 0 | 0 | 0 | 0 |
| 20.01.2018 23:00 - 24:00 | 0 | 0 | 0 | 0 |
| 21.01.2018 00:00 - 01:00 | 0 | 0 | 0 | 0 |
| 21.01.2018 01:00 - 02:00 | 0 | -70 | 0 | 0 |
| 21.01.2018 02:00 - 03:00 | 0 | -70 | 0 | 0 |
| 21.01.2018 03:00 - 04:00 | 0 | -70 | 0 | 0 |
| 21.01.2018 04:00 - 05:00 | 0 | -70 | 0 | 0 |
| 21.01.2018 05:00 - 06:00 | 0 | -70 | 0 | 0 |
| 21.01.2018 06:00 - 07:00 | 0 | 0 | 0 | 0 |
| 21.01.2018 07:00 - 08:00 | 0 | 0 | 0 | 0 |
| 21.01.2018 08:00 - 09:00 | 0 | 0 | 0 | 0 |
| 21.01.2018 09:00 - 10:00 | 0 | 0 | 0 | 0 |
| 21.01.2018 10:00 - 11:00 | 0 | 0 | 0 | 0 |
| 21.01.2018 11:00 - 12:00 | 0 | 0 | 0 | 0 |
| 21.01.2018 12:00 - 13:00 | 0 | 0 | 0 | 0 |
| 21.01.2018 13:00 - 14:00 | 0 | 0 | 0 | 0 |
| 21.01.2018 14:00 - 15:00 | 0 | 0 | 0 | 0 |
| 21.01.2018 15:00 - 16:00 | 0 | 0 | 0 | 0 |
| 21.01.2018 16:00 - 17:00 | 0 | 0 | 0 | 0 |
| 21.01.2018 17:00 - 18:00 | 0 | 0 | 0 | 0 |
| 21.01.2018 18:00 - 19:00 | 0 | 0 | 0 | 0 |
| 21.01.2018 19:00 - 20:00 | 0 | 0 | 0 | 0 |
| 21.01.2018 20:00 - 21:00 | 0 | 0 | 0 | 0 |
| 21.01.2018 21:00 - 22:00 | 0 | 0 | 0 | 0 |
| 21.01.2018 22:00 - 23:00 | 40 | 0 | 0 | 0 |
| 21.01.2018 23:00 - 24:00 | 40 | 0 | 0 | 0 |
| 22.01.2018 00:00 - 01:00 | 60 | 0 | 0 | 0 |
| 22.01.2018 01:00 - 02:00 | 60 | 0 | 0 | 0 |
| 22.01.2018 02:00 - 03:00 | 60 | 0 | 0 | 0 |
| 22.01.2018 03:00 - 04:00 | 60 | 0 | 0 | 0 |
| 22.01.2018 04:00 - 05:00 | 60 | 0 | 0 | 0 |
| 22.01.2018 05:00 - 06:00 | 60 | 0 | 0 | 0 |
| 22.01.2018 06:00 - 07:00 | 0 | 0 | 0 | 0 |
| 22.01.2018 07:00 - 08:00 | 0 | 0 | 0 | 0 |
| 22.01.2018 08:00 - 09:00 | 0 | 0 | 0 | 0 |
| 22.01.2018 09:00 - 10:00 | 0 | 0 | 0 | 0 |
| 22.01.2018 10:00 - 11:00 | 0 | 0 | 0 | 0 |
| 22.01.2018 11:00 - 12:00 | 0 | 0 | 0 | 0 |
| 22.01.2018 12:00 - 13:00 | 0 | 0 | 0 | 0 |
| 22.01.2018 13:00 - 14:00 | 0 | 0 | 0 | 0 |
| 22.01.2018 14:00 - 15:00 | 0 | 0 | 0 | 0 |
| 22.01.2018 15:00 - 16:00 | 0 | 0 | 0 | 0 |
| 22.01.2018 16:00 - 17:00 | 0 | 0 | 0 | 0 |
| 22.01.2018 17:00 - 18:00 | 0 | 0 | 0 | 0 |
| 22.01.2018 18:00 - 19:00 | 0 | 0 | 0 | 0 |
| 22.01.2018 19:00 - 20:00 | 0 | 0 | 0 | 0 |
| 22.01.2018 20:00 - 21:00 | 0 | 0 | 0 | 0 |
| 22.01.2018 21:00 - 22:00 | 0 | 0 | 0 | 0 |
| 22.01.2018 22:00 - 23:00 | 0 | 0 | 0 | 0 |
| 22.01.2018 23:00 - 24:00 | 0 | 0 | 0 | 0 |
| 23.01.2018 00:00 - 01:00 | 0 | 0 | 0 | 0 |
| 23.01.2018 01:00 - 02:00 | 0 | 0 | 0 | 0 |
| 23.01.2018 02:00 - 03:00 | 0 | 0 | 0 | 0 |
| 23.01.2018 03:00 - 04:00 | 0 | 0 | 0 | 0 |
| 23.01.2018 04:00 - 05:00 | 0 | 0 | 0 | 0 |
| 23.01.2018 05:00 - 06:00 | 0 | 0 | 0 | 0 |
| 23.01.2018 06:00 - 07:00 | 0 | 0 | 0 | 0 |
| 23.01.2018 07:00 - 08:00 | 0 | 0 | 0 | 0 |
| 23.01.2018 08:00 - 09:00 | 0 | 0 | 0 | 0 |
| 23.01.2018 09:00 - 10:00 | 0 | 0 | 0 | 0 |
| 23.01.2018 10:00 - 11:00 | 0 | 0 | 0 | 0 |
| 23.01.2018 11:00 - 12:00 | 0 | 0 | 0 | 0 |
| 23.01.2018 12:00 - 13:00 | 0 | 0 | 0 | 0 |
| 23.01.2018 13:00 - 14:00 | 0 | 0 | 0 | 0 |
| 23.01.2018 14:00 - 15:00 | 0 | 0 | 0 | 0 |
| 23.01.2018 15:00 - 16:00 | 0 | 0 | 0 | 0 |
| 23.01.2018 16:00 - 17:00 | 0 | 0 | 0 | 0 |
| 23.01.2018 17:00 - 18:00 | 0 | 0 | 0 | 0 |
| 23.01.2018 18:00 - 19:00 | 0 | 0 | 0 | 0 |
| 23.01.2018 19:00 - 20:00 | 0 | 0 | 0 | 0 |
| 23.01.2018 20:00 - 21:00 | 0 | 0 | 0 | 0 |
| 23.01.2018 21:00 - 22:00 | 0 | 0 | 0 | 0 |
| 23.01.2018 22:00 - 23:00 | 0 | 0 | 0 | 0 |
| 23.01.2018 23:00 - 24:00 | 0 | 0 | 0 | 0 |
| 24.01.2018 00:00 - 01:00 | 0 | 0 | 0 | 0 |
| 24.01.2018 01:00 - 02:00 | 0 | 0 | 0 | 0 |
| 24.01.2018 02:00 - 03:00 | 40 | 0 | 0 | 0 |
| 24.01.2018 03:00 - 04:00 | 40 | 0 | 0 | 0 |
| 24.01.2018 04:00 - 05:00 | 40 | 0 | 0 | 0 |
| 24.01.2018 05:00 - 06:00 | 240 | 0 | 0 | 0 |
| 24.01.2018 06:00 - 07:00 | 0 | 0 | 0 | 0 |
| 24.01.2018 07:00 - 08:00 | 0 | 0 | 0 | 0 |
| 24.01.2018 08:00 - 09:00 | 0 | 0 | 0 | 0 |
| 24.01.2018 09:00 - 10:00 | 0 | 0 | 0 | 0 |
| 24.01.2018 10:00 - 11:00 | 0 | 0 | 0 | 0 |
| 24.01.2018 11:00 - 12:00 | 0 | 0 | 0 | 0 |
| 24.01.2018 12:00 - 13:00 | 0 | 0 | 0 | 0 |
| 24.01.2018 13:00 - 14:00 | 0 | 0 | 0 | 0 |
| 24.01.2018 14:00 - 15:00 | 0 | 0 | 0 | 0 |
| 24.01.2018 15:00 - 16:00 | 0 | 0 | 0 | 0 |
| 24.01.2018 16:00 - 17:00 | 0 | 0 | 0 | 0 |
| 24.01.2018 17:00 - 18:00 | 0 | 0 | 0 | 0 |
| 24.01.2018 18:00 - 19:00 | 0 | 0 | 0 | 0 |
| 24.01.2018 19:00 - 20:00 | 0 | 0 | 0 | 0 |
| 24.01.2018 20:00 - 21:00 | 0 | 0 | 0 | 0 |
| 24.01.2018 21:00 - 22:00 | 0 | 0 | 0 | 0 |
| 24.01.2018 22:00 - 23:00 | 0 | 0 | 0 | 0 |
| 24.01.2018 23:00 - 24:00 | 0 | 0 | 0 | 0 |
| 25.01.2018 00:00 - 01:00 | 0 | 0 | 0 | 0 |
| 25.01.2018 01:00 - 02:00 | 0 | 0 | 0 | 0 |
| 25.01.2018 02:00 - 03:00 | 0 | 0 | 0 | 0 |
| 25.01.2018 03:00 - 04:00 | 0 | 0 | 0 | 0 |
| 25.01.2018 04:00 - 05:00 | 0 | 0 | 0 | 0 |
| 25.01.2018 05:00 - 06:00 | 0 | 0 | 0 | 0 |
| 25.01.2018 06:00 - 07:00 | 0 | 0 | 0 | 0 |
| 25.01.2018 07:00 - 08:00 | 0 | 0 | 0 | 0 |
| 25.01.2018 08:00 - 09:00 | 0 | 0 | 0 | 0 |
| 25.01.2018 09:00 - 10:00 | 0 | 0 | 0 | 0 |
| 25.01.2018 10:00 - 11:00 | 0 | 0 | 0 | 0 |
| 25.01.2018 11:00 - 12:00 | 0 | 0 | 0 | 0 |
| 25.01.2018 12:00 - 13:00 | 0 | 0 | 0 | 0 |
| 25.01.2018 13:00 - 14:00 | 0 | 0 | 0 | 0 |
| 25.01.2018 14:00 - 15:00 | 0 | 0 | 0 | 0 |
| 25.01.2018 15:00 - 16:00 | 0 | 0 | 0 | 0 |
| 25.01.2018 16:00 - 17:00 | 0 | 0 | 0 | 0 |
| 25.01.2018 17:00 - 18:00 | 0 | 0 | 0 | 0 |
| 25.01.2018 18:00 - 19:00 | 0 | 0 | 0 | 0 |
| 25.01.2018 19:00 - 20:00 | 0 | 0 | 0 | 0 |
| 25.01.2018 20:00 - 21:00 | 0 | 0 | 0 | 0 |
| 25.01.2018 21:00 - 22:00 | 0 | 0 | 0 | 0 |
| 25.01.2018 22:00 - 23:00 | 0 | 0 | 0 | 0 |
| 25.01.2018 23:00 - 24:00 | 0 | 0 | 0 | 0 |
| 26.01.2018 00:00 - 01:00 | 0 | 0 | 0 | 0 |
| 26.01.2018 01:00 - 02:00 | 0 | 0 | 0 | 0 |
| 26.01.2018 02:00 - 03:00 | 0 | 0 | 0 | 0 |
| 26.01.2018 03:00 - 04:00 | 0 | 0 | 0 | 0 |
| 26.01.2018 04:00 - 05:00 | 0 | 0 | 0 | 0 |
| 26.01.2018 05:00 - 06:00 | 0 | 0 | 0 | 0 |
| 26.01.2018 06:00 - 07:00 | 0 | 0 | 0 | 0 |
| 26.01.2018 07:00 - 08:00 | 0 | 0 | 0 | 0 |
| 26.01.2018 08:00 - 09:00 | 0 | 0 | 0 | 0 |
| 26.01.2018 09:00 - 10:00 | 0 | 0 | 0 | 0 |
| 26.01.2018 10:00 - 11:00 | 0 | 0 | 0 | 0 |
| 26.01.2018 11:00 - 12:00 | 0 | 0 | 0 | 0 |
| 26.01.2018 12:00 - 13:00 | 0 | 0 | 0 | 0 |
| 26.01.2018 13:00 - 14:00 | 0 | 0 | 0 | 0 |
| 26.01.2018 14:00 - 15:00 | 0 | 0 | 0 | 0 |
| 26.01.2018 15:00 - 16:00 | 0 | 0 | 0 | 0 |
| 26.01.2018 16:00 - 17:00 | 0 | 0 | 0 | 0 |
| 26.01.2018 17:00 - 18:00 | 0 | 0 | 0 | 0 |
| 26.01.2018 18:00 - 19:00 | 0 | 0 | 0 | 0 |
| 26.01.2018 19:00 - 20:00 | 0 | 0 | 0 | 0 |
| 26.01.2018 20:00 - 21:00 | 0 | 0 | 0 | 0 |
| 26.01.2018 21:00 - 22:00 | 0 | 0 | 0 | 0 |
| 26.01.2018 22:00 - 23:00 | 0 | 0 | 0 | 0 |
| 26.01.2018 23:00 - 24:00 | 0 | 0 | 0 | 0 |
| 27.01.2018 00:00 - 01:00 | 0 | 0 | 0 | 0 |
| 27.01.2018 01:00 - 02:00 | 0 | 0 | 0 | 0 |
| 27.01.2018 02:00 - 03:00 | 0 | 0 | 0 | 0 |
| 27.01.2018 03:00 - 04:00 | 0 | 0 | 0 | 0 |
| 27.01.2018 04:00 - 05:00 | 0 | 0 | 0 | 0 |
| 27.01.2018 05:00 - 06:00 | 0 | 0 | 0 | 0 |
| 27.01.2018 06:00 - 07:00 | 0 | 0 | 0 | 0 |
| 27.01.2018 07:00 - 08:00 | 0 | 0 | 0 | 0 |
| 27.01.2018 08:00 - 09:00 | 0 | 0 | 0 | 0 |
| 27.01.2018 09:00 - 10:00 | 0 | 0 | 0 | 0 |
| 27.01.2018 10:00 - 11:00 | 0 | 0 | 0 | 0 |
| 27.01.2018 11:00 - 12:00 | 0 | 0 | 0 | 0 |
| 27.01.2018 12:00 - 13:00 | 0 | 0 | 0 | 0 |
| 27.01.2018 13:00 - 14:00 | 0 | 0 | 0 | 0 |
| 27.01.2018 14:00 - 15:00 | 0 | 0 | 0 | 0 |
| 27.01.2018 15:00 - 16:00 | 0 | 0 | 0 | 0 |
| 27.01.2018 16:00 - 17:00 | 0 | 0 | 0 | 0 |
| 27.01.2018 17:00 - 18:00 | 0 | 0 | 0 | 0 |
| 27.01.2018 18:00 - 19:00 | 0 | 0 | 0 | 0 |
| 27.01.2018 19:00 - 20:00 | 0 | 0 | 0 | 0 |
| 27.01.2018 20:00 - 21:00 | 0 | 0 | 0 | 0 |
| 27.01.2018 21:00 - 22:00 | 0 | 0 | 0 | 0 |
| 27.01.2018 22:00 - 23:00 | 0 | 0 | 0 | 0 |
| 27.01.2018 23:00 - 24:00 | 0 | 0 | 0 | 0 |
| 28.01.2018 00:00 - 01:00 | 0 | 0 | 0 | 0 |
| 28.01.2018 01:00 - 02:00 | 0 | 0 | 0 | 0 |
| 28.01.2018 02:00 - 03:00 | 0 | 0 | 0 | 0 |
| 28.01.2018 03:00 - 04:00 | 0 | 0 | 0 | 0 |
| 28.01.2018 04:00 - 05:00 | 0 | 0 | 0 | 0 |
| 28.01.2018 05:00 - 06:00 | 0 | 0 | 0 | 0 |
| 28.01.2018 06:00 - 07:00 | 0 | 0 | 0 | 0 |
| 28.01.2018 07:00 - 08:00 | 0 | 0 | 0 | 0 |
| 28.01.2018 08:00 - 09:00 | 0 | 0 | 0 | 0 |
| 28.01.2018 09:00 - 10:00 | 0 | 0 | 0 | 0 |
| 28.01.2018 10:00 - 11:00 | 0 | 0 | 0 | 0 |
| 28.01.2018 11:00 - 12:00 | 0 | 0 | 0 | 0 |
| 28.01.2018 12:00 - 13:00 | 0 | 0 | 0 | 0 |
| 28.01.2018 13:00 - 14:00 | 0 | 0 | 0 | 0 |
| 28.01.2018 14:00 - 15:00 | 0 | 0 | 0 | 0 |
| 28.01.2018 15:00 - 16:00 | 0 | 0 | 0 | 0 |
| 28.01.2018 16:00 - 17:00 | 0 | 0 | 0 | 0 |
| 28.01.2018 17:00 - 18:00 | 0 | 0 | 0 | 0 |
| 28.01.2018 18:00 - 19:00 | 0 | 0 | 0 | 0 |
| 28.01.2018 19:00 - 20:00 | 0 | 0 | 0 | 0 |
| 28.01.2018 20:00 - 21:00 | 0 | 0 | 0 | 0 |
| 28.01.2018 21:00 - 22:00 | 0 | 0 | 0 | 0 |
| 28.01.2018 22:00 - 23:00 | 0 | 0 | 0 | 0 |
| 28.01.2018 23:00 - 24:00 | 0 | 0 | 0 | 0 |
| 29.01.2018 00:00 - 01:00 | 0 | 0 | 0 | 0 |
| 29.01.2018 01:00 - 02:00 | 0 | 0 | 0 | 0 |
| 29.01.2018 02:00 - 03:00 | 0 | 0 | 0 | 0 |
| 29.01.2018 03:00 - 04:00 | 0 | 0 | 0 | 0 |
| 29.01.2018 04:00 - 05:00 | 0 | 0 | 0 | 0 |
| 29.01.2018 05:00 - 06:00 | 0 | 0 | 0 | 0 |
| 29.01.2018 06:00 - 07:00 | 0 | 0 | 0 | 0 |
| 29.01.2018 07:00 - 08:00 | 0 | 0 | 0 | 0 |
| 29.01.2018 08:00 - 09:00 | 0 | 0 | 0 | 0 |
| 29.01.2018 09:00 - 10:00 | 0 | 0 | 0 | 0 |
| 29.01.2018 10:00 - 11:00 | 0 | 0 | 0 | 0 |
| 29.01.2018 11:00 - 12:00 | 0 | 0 | 0 | 0 |
| 29.01.2018 12:00 - 13:00 | 0 | 0 | 0 | 0 |
| 29.01.2018 13:00 - 14:00 | 0 | 0 | 0 | 0 |
| 29.01.2018 14:00 - 15:00 | 0 | 0 | 0 | 0 |
| 29.01.2018 15:00 - 16:00 | 0 | 0 | 0 | 0 |
| 29.01.2018 16:00 - 17:00 | 0 | 0 | 0 | 0 |
| 29.01.2018 17:00 - 18:00 | 0 | 0 | 0 | 0 |
| 29.01.2018 18:00 - 19:00 | 0 | 0 | 0 | 0 |
| 29.01.2018 19:00 - 20:00 | 0 | 0 | 0 | 0 |
| 29.01.2018 20:00 - 21:00 | 0 | 0 | 0 | 0 |
| 29.01.2018 21:00 - 22:00 | 0 | 0 | 0 | 0 |
| 29.01.2018 22:00 - 23:00 | 0 | 0 | 0 | 0 |
| 29.01.2018 23:00 - 24:00 | 0 | 0 | 0 | 0 |
| 30.01.2018 00:00 - 01:00 | 0 | 0 | 0 | 0 |
| 30.01.2018 01:00 - 02:00 | 0 | 0 | 0 | 0 |
| 30.01.2018 02:00 - 03:00 | 0 | 0 | 0 | 0 |
| 30.01.2018 03:00 - 04:00 | 0 | 0 | 0 | 0 |
| 30.01.2018 04:00 - 05:00 | 0 | 0 | 0 | 0 |
| 30.01.2018 05:00 - 06:00 | 0 | 0 | 0 | 0 |
| 30.01.2018 06:00 - 07:00 | 0 | 0 | 0 | 0 |
| 30.01.2018 07:00 - 08:00 | 0 | 0 | 0 | 0 |
| 30.01.2018 08:00 - 09:00 | 0 | 0 | 0 | 0 |
| 30.01.2018 09:00 - 10:00 | 0 | 0 | 0 | 0 |
| 30.01.2018 10:00 - 11:00 | 0 | 0 | 0 | 0 |
| 30.01.2018 11:00 - 12:00 | 0 | 0 | 0 | 0 |
| 30.01.2018 12:00 - 13:00 | 0 | 0 | 0 | 0 |
| 30.01.2018 13:00 - 14:00 | 0 | 0 | 0 | 0 |
| 30.01.2018 14:00 - 15:00 | 0 | 0 | 0 | 0 |
| 30.01.2018 15:00 - 16:00 | 0 | 0 | 0 | 0 |
| 30.01.2018 16:00 - 17:00 | 0 | 0 | 0 | 0 |
| 30.01.2018 17:00 - 18:00 | 0 | 0 | 0 | 0 |
| 30.01.2018 18:00 - 19:00 | 0 | 0 | 0 | 0 |
| 30.01.2018 19:00 - 20:00 | 0 | 0 | 0 | 0 |
| 30.01.2018 20:00 - 21:00 | 0 | 0 | 0 | 0 |
| 30.01.2018 21:00 - 22:00 | 0 | 0 | 0 | 0 |
| 30.01.2018 22:00 - 23:00 | 0 | 0 | 0 | 0 |
| 30.01.2018 23:00 - 24:00 | 0 | 0 | 0 | 0 |
| 31.01.2018 00:00 - 01:00 | 0 | 0 | 0 | 0 |
| 31.01.2018 01:00 - 02:00 | 0 | 0 | 0 | 0 |
| 31.01.2018 02:00 - 03:00 | 0 | 0 | 0 | 0 |
| 31.01.2018 03:00 - 04:00 | 0 | 0 | 0 | 0 |
| 31.01.2018 04:00 - 05:00 | 0 | 0 | 0 | 0 |
| 31.01.2018 05:00 - 06:00 | 0 | 0 | 0 | 0 |
| 31.01.2018 06:00 - 07:00 | 0 | 0 | 0 | 0 |
| 31.01.2018 07:00 - 08:00 | 0 | 0 | 0 | 0 |
| 31.01.2018 08:00 - 09:00 | 0 | 0 | 0 | 0 |
| 31.01.2018 09:00 - 10:00 | 0 | 0 | 0 | 0 |
| 31.01.2018 10:00 - 11:00 | 0 | 0 | 0 | 0 |
| 31.01.2018 11:00 - 12:00 | 0 | 0 | 0 | 0 |
| 31.01.2018 12:00 - 13:00 | 0 | 0 | 0 | 0 |
| 31.01.2018 13:00 - 14:00 | 0 | 0 | 0 | 0 |
| 31.01.2018 14:00 - 15:00 | 0 | 0 | 0 | 0 |
| 31.01.2018 15:00 - 16:00 | 0 | 0 | 0 | 0 |
| 31.01.2018 16:00 - 17:00 | 0 | 0 | 0 | 0 |
| 31.01.2018 17:00 - 18:00 | 0 | 0 | 0 | 0 |
| 31.01.2018 18:00 - 19:00 | 0 | 0 | 0 | 0 |
| 31.01.2018 19:00 - 20:00 | 0 | 0 | 0 | 0 |
| 31.01.2018 20:00 - 21:00 | 0 | 0 | 0 | 0 |
| 31.01.2018 21:00 - 22:00 | 0 | 0 | 0 | 0 |
| 31.01.2018 22:00 - 23:00 | 0 | 0 | 0 | 0 |
| 31.01.2018 23:00 - 24:00 | 0 | 0 | 0 | 0 |
| 01.02.2018 00:00 - 01:00 | 0 | 0 | 0 | 0 |
| 01.02.2018 01:00 - 02:00 | 0 | 0 | 0 | 0 |
| 01.02.2018 02:00 - 03:00 | 0 | 0 | 0 | 0 |
| 01.02.2018 03:00 - 04:00 | 0 | 0 | 0 | 0 |
| 01.02.2018 04:00 - 05:00 | 0 | 0 | 0 | 0 |
| 01.02.2018 05:00 - 06:00 | 0 | 0 | 0 | 0 |